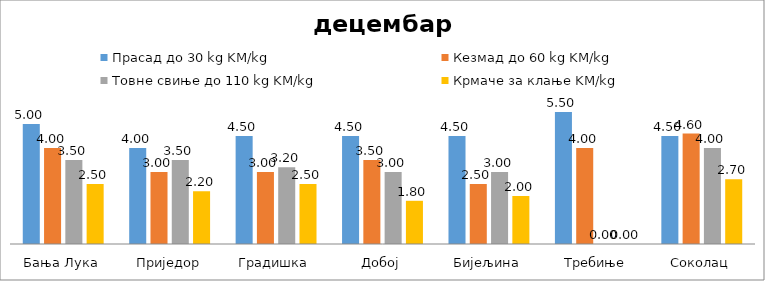
| Category | Прасад до 30 kg KM/kg | Кезмад до 60 kg KM/kg | Товне свиње до 110 kg KM/kg | Крмаче за клање KM/kg |
|---|---|---|---|---|
| Бања Лука | 5 | 4 | 3.5 | 2.5 |
| Приједор | 4 | 3 | 3.5 | 2.2 |
| Градишка | 4.5 | 3 | 3.2 | 2.5 |
| Добој | 4.5 | 3.5 | 3 | 1.8 |
| Бијељина | 4.5 | 2.5 | 3 | 2 |
|  Требиње | 5.5 | 4 | 0 | 0 |
| Соколац | 4.5 | 4.6 | 4 | 2.7 |